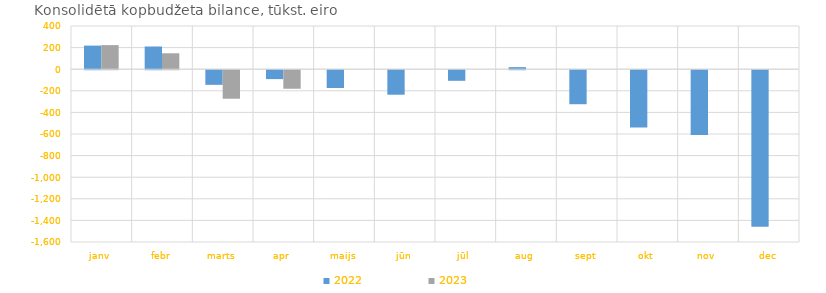
| Category | 2022 | 2023 |
|---|---|---|
| janv | 218389.091 | 223039.368 |
| febr | 210185.141 | 147311.843 |
| marts | -135684.596 | -264068.626 |
| apr | -82545.759 | -171713.076 |
| maijs | -165099.527 | 0 |
| jūn | -227076.221 | 0 |
| jūl | -98216.206 | 0 |
| aug | 19124.955 | 0 |
| sept | -315094.554 | 0 |
| okt | -529965.02 | 0 |
| nov | -599385.297 | 0 |
| dec | -1450688.242 | 0 |